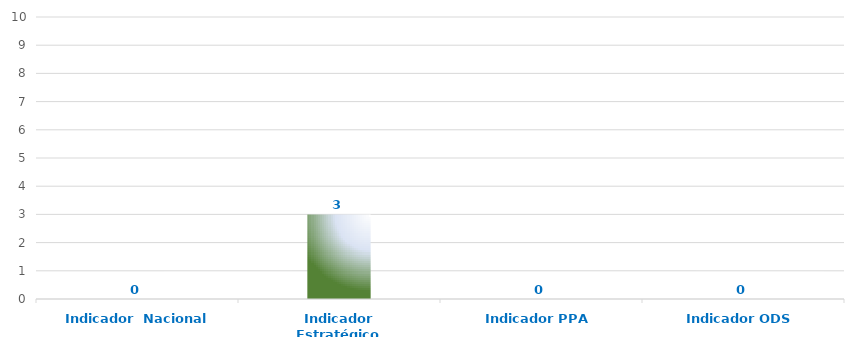
| Category | Series 0 |
|---|---|
| Indicador  Nacional | 0 |
| Indicador Estratégico | 3 |
| Indicador PPA | 0 |
| Indicador ODS | 0 |